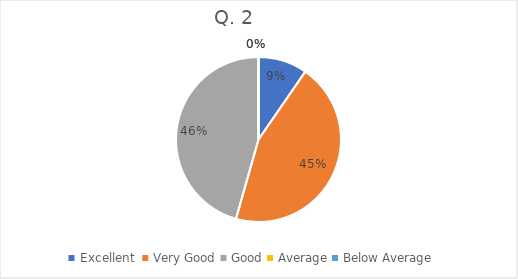
| Category | Series 0 |
|---|---|
| Excellent  | 12 |
| Very Good | 56 |
| Good | 57 |
| Average | 0 |
| Below Average | 0 |